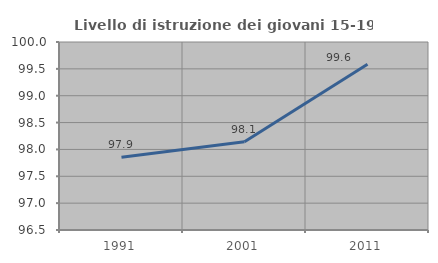
| Category | Livello di istruzione dei giovani 15-19 anni |
|---|---|
| 1991.0 | 97.856 |
| 2001.0 | 98.141 |
| 2011.0 | 99.584 |